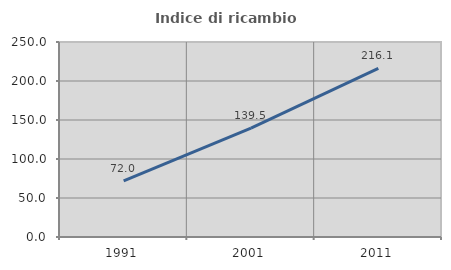
| Category | Indice di ricambio occupazionale  |
|---|---|
| 1991.0 | 71.986 |
| 2001.0 | 139.506 |
| 2011.0 | 216.129 |